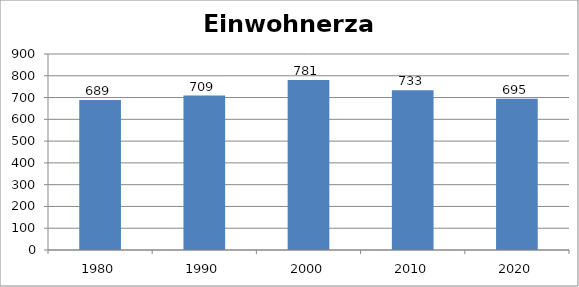
| Category | Einwohnerzahl |
|---|---|
| 1980.0 | 689 |
| 1990.0 | 709 |
| 2000.0 | 781 |
| 2010.0 | 733 |
| 2020.0 | 695 |